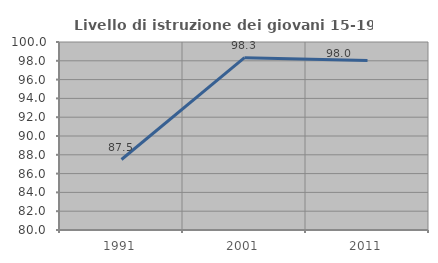
| Category | Livello di istruzione dei giovani 15-19 anni |
|---|---|
| 1991.0 | 87.5 |
| 2001.0 | 98.333 |
| 2011.0 | 98.039 |